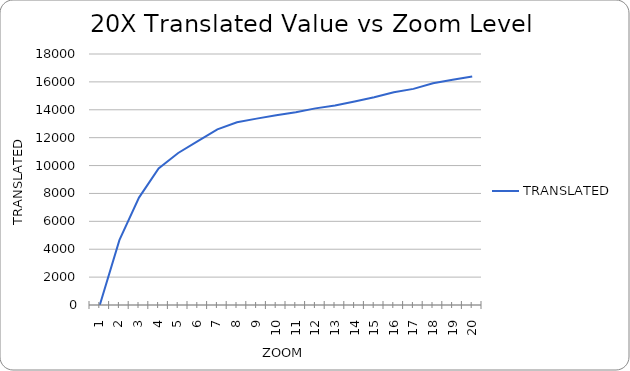
| Category | TRANSLATED |
|---|---|
| 1.0 | 0 |
| 2.0 | 4653.686 |
| 3.0 | 7702.055 |
| 4.0 | 9798.892 |
| 5.0 | 10900 |
| 6.0 | 11750 |
| 7.0 | 12600 |
| 8.0 | 13107.2 |
| 9.0 | 13365.563 |
| 10.0 | 13605.022 |
| 11.0 | 13827.151 |
| 12.0 | 14100 |
| 13.0 | 14300 |
| 14.0 | 14600 |
| 15.0 | 14900 |
| 16.0 | 15250 |
| 17.0 | 15500 |
| 18.0 | 15900 |
| 19.0 | 16150 |
| 20.0 | 16384 |